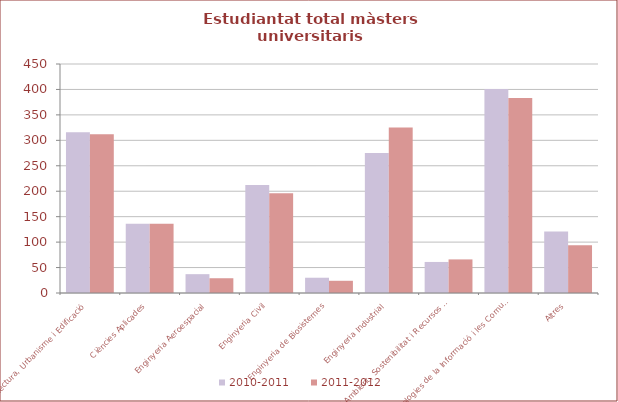
| Category | 2010-2011 | 2011-2012 |
|---|---|---|
| Arquitectura, Urbanisme i Edificació | 316 | 312 |
| Ciències Aplicades | 136 | 136 |
| Enginyeria Aeroespacial | 37 | 29 |
| Enginyeria Civil | 212 | 196 |
| Enginyeria de Biosistemes | 30 | 24 |
| Enginyeria Industrial | 275 | 325 |
| Medi Ambient, Sostenibilitat i Recursos Naturals | 61 | 66 |
| Tecnologies de la Informació i les Comunicacions | 401 | 383 |
| Altres | 121 | 94 |